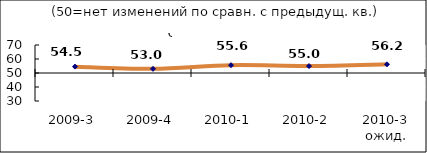
| Category | Диф.индекс ↓ |
|---|---|
| 2009-3 | 54.535 |
| 2009-4 | 52.96 |
| 2010-1 | 55.59 |
| 2010-2 | 54.975 |
| 2010-3 ожид. | 56.185 |